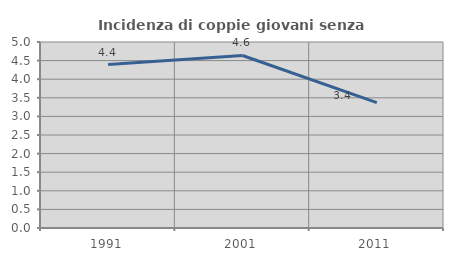
| Category | Incidenza di coppie giovani senza figli |
|---|---|
| 1991.0 | 4.395 |
| 2001.0 | 4.638 |
| 2011.0 | 3.371 |